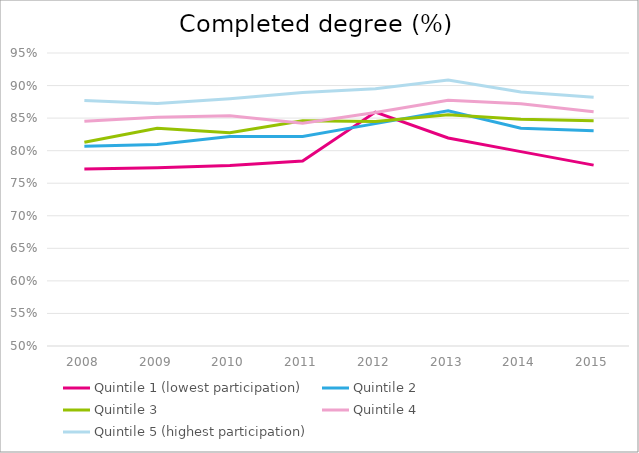
| Category | Quintile 1 (lowest participation) | Quintile 2 | Quintile 3 | Quintile 4 | Quintile 5 (highest participation) |
|---|---|---|---|---|---|
| 2008.0 | 0.772 | 0.807 | 0.813 | 0.845 | 0.877 |
| 2009.0 | 0.774 | 0.81 | 0.834 | 0.851 | 0.873 |
| 2010.0 | 0.777 | 0.822 | 0.828 | 0.854 | 0.88 |
| 2011.0 | 0.784 | 0.822 | 0.846 | 0.842 | 0.89 |
| 2012.0 | 0.859 | 0.842 | 0.845 | 0.859 | 0.895 |
| 2013.0 | 0.82 | 0.861 | 0.855 | 0.877 | 0.908 |
| 2014.0 | 0.799 | 0.835 | 0.848 | 0.872 | 0.89 |
| 2015.0 | 0.778 | 0.831 | 0.846 | 0.86 | 0.882 |